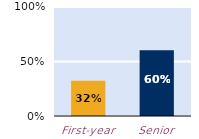
| Category | frequently |
|---|---|
| First-year | 0.324 |
| Senior | 0.604 |